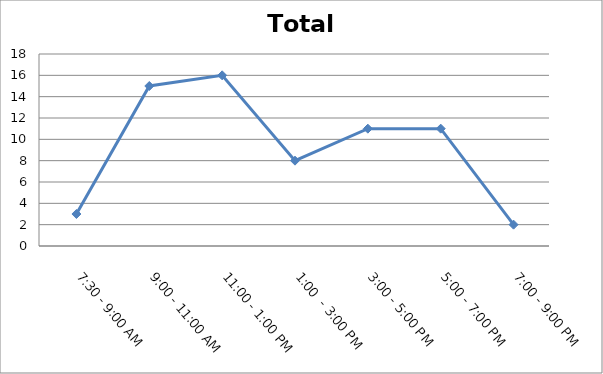
| Category | Total |
|---|---|
| 7:30 - 9:00 AM | 3 |
| 9:00 - 11:00 AM | 15 |
| 11:00 - 1:00 PM | 16 |
| 1:00  - 3:00 PM | 8 |
| 3:00 - 5:00 PM | 11 |
| 5:00 - 7:00 PM | 11 |
| 7:00 - 9:00 PM | 2 |